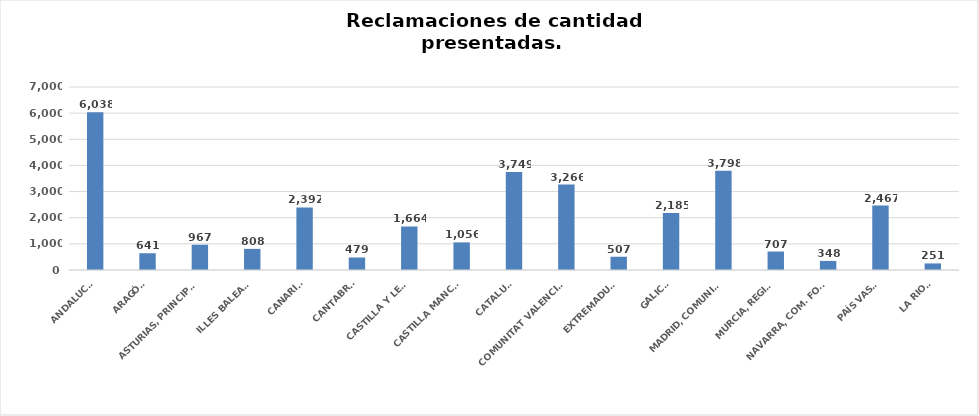
| Category | Series 0 |
|---|---|
| ANDALUCÍA | 6038 |
| ARAGÓN | 641 |
| ASTURIAS, PRINCIPADO | 967 |
| ILLES BALEARS | 808 |
| CANARIAS | 2392 |
| CANTABRIA | 479 |
| CASTILLA Y LEÓN | 1664 |
| CASTILLA MANCHA | 1056 |
| CATALUÑA | 3749 |
| COMUNITAT VALENCIANA | 3266 |
| EXTREMADURA | 507 |
| GALICIA | 2185 |
| MADRID, COMUNIDAD | 3798 |
| MURCIA, REGIÓN | 707 |
| NAVARRA, COM. FORAL | 348 |
| PAÍS VASCO | 2467 |
| LA RIOJA | 251 |